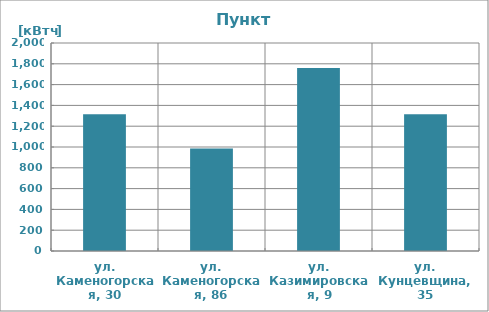
| Category | Series 0 |
|---|---|
| ул. Каменогорская, 30 | 1314 |
| ул. Каменогорская, 86 | 985.5 |
| ул. Казимировская, 9 | 1760.4 |
| ул. Кунцевщина, 35 | 1314 |